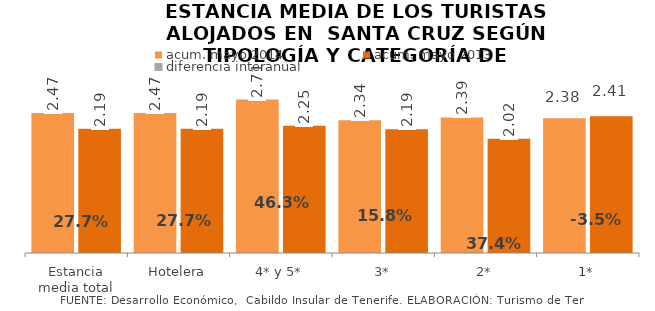
| Category | acum. mayo 2014 | acum. mayo 2013 |
|---|---|---|
| Estancia media total | 2.471 | 2.194 |
| Hotelera | 2.471 | 2.194 |
| 4* y 5* | 2.709 | 2.246 |
| 3* | 2.343 | 2.185 |
| 2* | 2.392 | 2.018 |
| 1* | 2.377 | 2.412 |